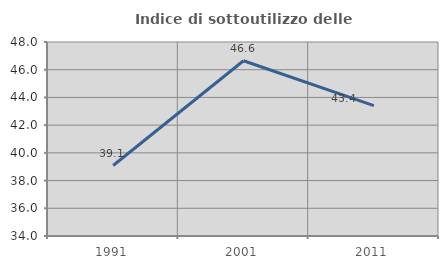
| Category | Indice di sottoutilizzo delle abitazioni  |
|---|---|
| 1991.0 | 39.085 |
| 2001.0 | 46.646 |
| 2011.0 | 43.413 |